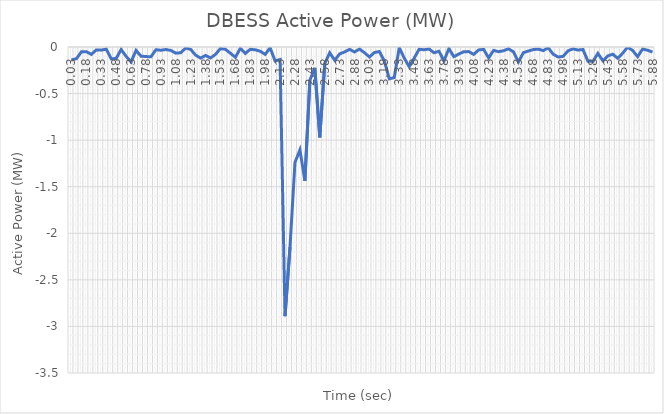
| Category | Active Power (MW) |
|---|---|
| 0.03 | -0.139 |
| 0.08 | -0.125 |
| 0.13 | -0.052 |
| 0.18 | -0.05 |
| 0.23 | -0.079 |
| 0.28 | -0.031 |
| 0.33 | -0.034 |
| 0.38 | -0.022 |
| 0.43 | -0.127 |
| 0.48 | -0.123 |
| 0.53 | -0.027 |
| 0.58 | -0.101 |
| 0.63 | -0.16 |
| 0.68 | -0.036 |
| 0.73 | -0.099 |
| 0.78 | -0.103 |
| 0.83 | -0.105 |
| 0.88 | -0.029 |
| 0.93 | -0.035 |
| 0.98 | -0.027 |
| 1.03 | -0.037 |
| 1.08 | -0.066 |
| 1.13 | -0.062 |
| 1.18 | -0.011 |
| 1.23 | -0.026 |
| 1.28 | -0.088 |
| 1.33 | -0.12 |
| 1.38 | -0.09 |
| 1.43 | -0.118 |
| 1.48 | -0.079 |
| 1.53 | -0.016 |
| 1.58 | -0.025 |
| 1.63 | -0.067 |
| 1.68 | -0.11 |
| 1.73 | -0.015 |
| 1.78 | -0.069 |
| 1.83 | -0.025 |
| 1.88 | -0.03 |
| 1.93 | -0.046 |
| 1.98 | -0.079 |
| 2.03 | -0.009 |
| 2.08 | -0.15 |
| 2.13 | -0.134 |
| 2.18 | -2.89 |
| 2.23 | -2.149 |
| 2.28 | -1.24 |
| 2.33 | -1.104 |
| 2.38 | -1.437 |
| 2.43 | -0.357 |
| 2.48 | -0.223 |
| 2.53 | -0.97 |
| 2.58 | -0.178 |
| 2.63 | -0.063 |
| 2.68 | -0.142 |
| 2.73 | -0.074 |
| 2.78 | -0.053 |
| 2.83 | -0.025 |
| 2.88 | -0.053 |
| 2.93 | -0.022 |
| 2.98 | -0.062 |
| 3.03 | -0.107 |
| 3.08 | -0.059 |
| 3.13 | -0.049 |
| 3.18 | -0.151 |
| 3.23 | -0.342 |
| 3.28 | -0.328 |
| 3.33 | -0.006 |
| 3.38 | -0.118 |
| 3.43 | -0.211 |
| 3.48 | -0.12 |
| 3.53 | -0.025 |
| 3.58 | -0.03 |
| 3.63 | -0.021 |
| 3.68 | -0.062 |
| 3.73 | -0.046 |
| 3.78 | -0.149 |
| 3.83 | -0.017 |
| 3.88 | -0.104 |
| 3.93 | -0.075 |
| 3.98 | -0.051 |
| 4.03 | -0.049 |
| 4.08 | -0.079 |
| 4.13 | -0.031 |
| 4.18 | -0.026 |
| 4.23 | -0.118 |
| 4.28 | -0.037 |
| 4.33 | -0.05 |
| 4.38 | -0.04 |
| 4.43 | -0.019 |
| 4.48 | -0.052 |
| 4.53 | -0.16 |
| 4.58 | -0.061 |
| 4.63 | -0.043 |
| 4.68 | -0.027 |
| 4.73 | -0.023 |
| 4.78 | -0.039 |
| 4.83 | -0.008 |
| 4.88 | -0.077 |
| 4.93 | -0.108 |
| 4.98 | -0.1 |
| 5.03 | -0.04 |
| 5.08 | -0.02 |
| 5.13 | -0.033 |
| 5.18 | -0.027 |
| 5.23 | -0.153 |
| 5.28 | -0.154 |
| 5.33 | -0.069 |
| 5.38 | -0.148 |
| 5.43 | -0.096 |
| 5.48 | -0.077 |
| 5.53 | -0.122 |
| 5.58 | -0.066 |
| 5.63 | -0.001 |
| 5.68 | -0.037 |
| 5.73 | -0.104 |
| 5.78 | -0.022 |
| 5.83 | -0.035 |
| 5.88 | -0.055 |